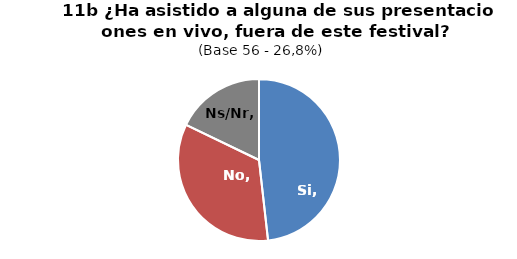
| Category | Series 0 |
|---|---|
| Si | 0.129 |
| No | 0.091 |
| Ns/Nr | 0.048 |